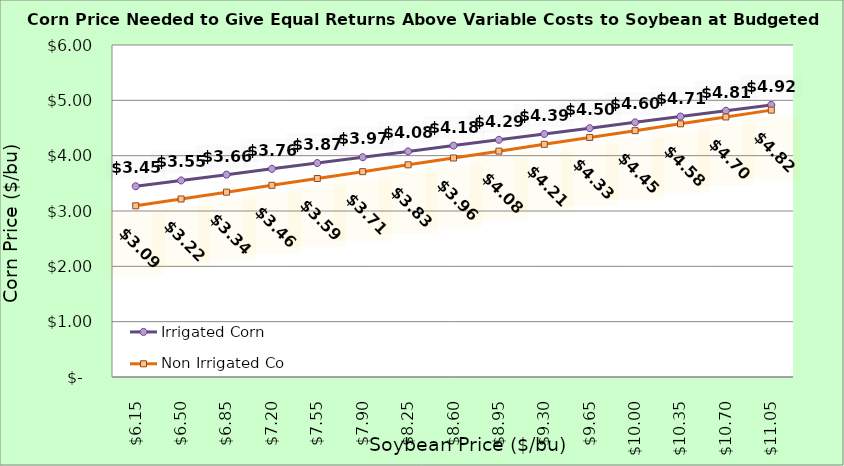
| Category | Irrigated Corn | Non Irrigated Corn |
|---|---|---|
| 6.150000000000002 | 3.447 | 3.093 |
| 6.500000000000002 | 3.552 | 3.217 |
| 6.850000000000001 | 3.657 | 3.34 |
| 7.200000000000001 | 3.762 | 3.464 |
| 7.550000000000001 | 3.867 | 3.587 |
| 7.9 | 3.972 | 3.711 |
| 8.25 | 4.077 | 3.835 |
| 8.6 | 4.182 | 3.958 |
| 8.95 | 4.287 | 4.082 |
| 9.299999999999999 | 4.392 | 4.205 |
| 9.649999999999999 | 4.497 | 4.329 |
| 9.999999999999998 | 4.602 | 4.452 |
| 10.349999999999998 | 4.707 | 4.576 |
| 10.699999999999998 | 4.812 | 4.699 |
| 11.049999999999997 | 4.917 | 4.823 |